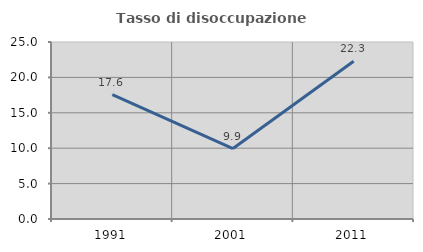
| Category | Tasso di disoccupazione giovanile  |
|---|---|
| 1991.0 | 17.568 |
| 2001.0 | 9.948 |
| 2011.0 | 22.283 |